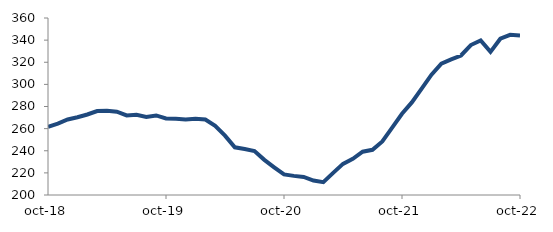
| Category | Series 0 |
|---|---|
| 2018-10-01 | 261.709 |
| 2018-11-01 | 264.559 |
| 2018-12-01 | 268.288 |
| 2019-01-01 | 270.264 |
| 2019-02-01 | 272.765 |
| 2019-03-01 | 275.922 |
| 2019-04-01 | 276.17 |
| 2019-05-01 | 275.323 |
| 2019-06-01 | 271.933 |
| 2019-07-01 | 272.528 |
| 2019-08-01 | 270.617 |
| 2019-09-01 | 271.909 |
| 2019-10-01 | 269.246 |
| 2019-11-01 | 268.873 |
| 2019-12-01 | 268.319 |
| 2020-01-01 | 268.914 |
| 2020-02-01 | 268.233 |
| 2020-03-01 | 262.58 |
| 2020-04-01 | 253.663 |
| 2020-05-01 | 243.088 |
| 2020-06-01 | 241.541 |
| 2020-07-01 | 239.786 |
| 2020-08-01 | 231.766 |
| 2020-09-01 | 225.047 |
| 2020-10-01 | 218.571 |
| 2020-11-01 | 217.286 |
| 2020-12-01 | 216.368 |
| 2021-01-01 | 213.087 |
| 2021-02-01 | 211.643 |
| 2021-03-01 | 220.04 |
| 2021-04-01 | 228.12 |
| 2021-05-01 | 232.717 |
| 2021-06-01 | 239.097 |
| 2021-07-01 | 240.846 |
| 2021-08-01 | 248.449 |
| 2021-09-01 | 260.934 |
| 2021-10-01 | 273.441 |
| 2021-11-01 | 283.683 |
| 2021-12-01 | 296.134 |
| 2022-01-01 | 308.804 |
| 2022-02-01 | 318.726 |
| 2022-03-01 | 322.592 |
| 2022-04-01 | 326.114 |
| 2022-05-01 | 335.557 |
| 2022-06-01 | 339.684 |
| 2022-07-01 | 329.357 |
| 2022-08-01 | 341.293 |
| 2022-09-01 | 344.793 |
| 2022-10-01 | 344.185 |